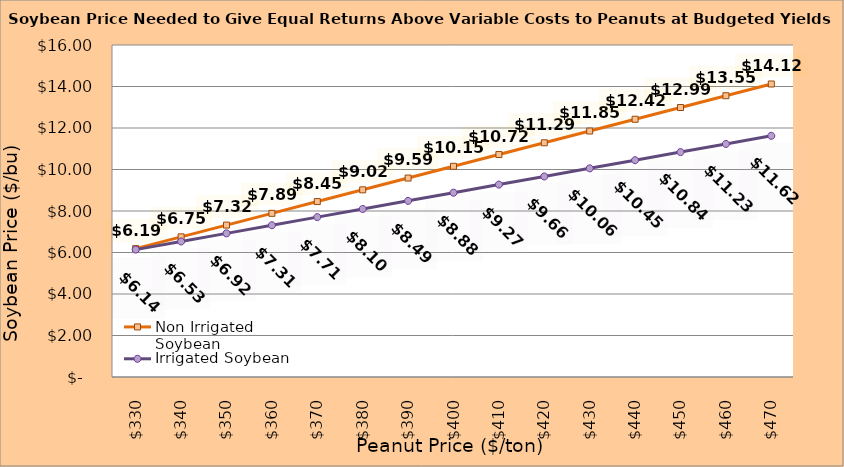
| Category | Non Irrigated Soybean | Irrigated Soybean |
|---|---|---|
| 330.0 | 6.188 | 6.139 |
| 340.0 | 6.754 | 6.531 |
| 350.0 | 7.321 | 6.923 |
| 360.0 | 7.888 | 7.314 |
| 370.0 | 8.454 | 7.706 |
| 380.0 | 9.021 | 8.098 |
| 390.0 | 9.588 | 8.489 |
| 400.0 | 10.154 | 8.881 |
| 410.0 | 10.721 | 9.273 |
| 420.0 | 11.288 | 9.664 |
| 430.0 | 11.854 | 10.056 |
| 440.0 | 12.421 | 10.448 |
| 450.0 | 12.988 | 10.839 |
| 460.0 | 13.554 | 11.231 |
| 470.0 | 14.121 | 11.623 |